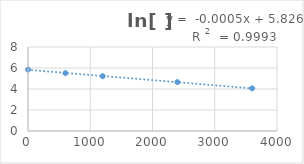
| Category | Series 0 |
|---|---|
| 0.0 | 5.852 |
| 600.0 | 5.509 |
| 1200.0 | 5.22 |
| 2400.0 | 4.654 |
| 3600.0 | 4.06 |